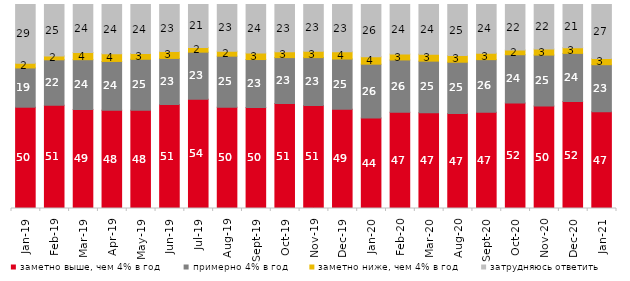
| Category | заметно выше, чем 4% в год | примерно 4% в год | заметно ниже, чем 4% в год | затрудняюсь ответить |
|---|---|---|---|---|
| 2019-01-01 | 49.65 | 19.25 | 2.3 | 28.8 |
| 2019-02-01 | 50.65 | 22.25 | 1.9 | 25.2 |
| 2019-03-01 | 48.583 | 24.366 | 3.531 | 23.521 |
| 2019-04-01 | 48.119 | 23.96 | 3.762 | 24.158 |
| 2019-05-01 | 48.143 | 25.012 | 2.823 | 24.022 |
| 2019-06-01 | 50.923 | 22.643 | 3.392 | 23.042 |
| 2019-07-01 | 53.614 | 23.02 | 2.327 | 21.04 |
| 2019-08-01 | 49.65 | 25.025 | 2.448 | 22.877 |
| 2019-09-01 | 49.554 | 23.465 | 3.168 | 23.812 |
| 2019-10-01 | 51.436 | 22.525 | 2.822 | 23.218 |
| 2019-11-01 | 50.545 | 23.416 | 3.069 | 22.97 |
| 2019-12-01 | 48.663 | 24.604 | 3.515 | 23.218 |
| 2020-01-01 | 44.307 | 26.436 | 3.614 | 25.644 |
| 2020-02-01 | 47.178 | 25.644 | 2.871 | 24.307 |
| 2020-03-01 | 46.901 | 25.335 | 3.421 | 24.343 |
| 2020-08-01 | 46.524 | 25.174 | 3.277 | 25.025 |
| 2020-09-01 | 47.188 | 25.784 | 3.136 | 23.892 |
| 2020-10-01 | 51.769 | 23.617 | 2.292 | 22.322 |
| 2020-11-01 | 50.3 | 24.9 | 2.95 | 21.85 |
| 2020-12-01 | 52.405 | 23.599 | 2.776 | 21.17 |
| 2021-01-01 | 47.442 | 23.05 | 2.981 | 26.528 |